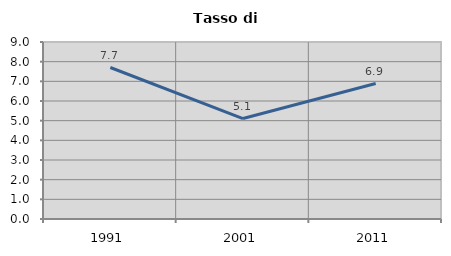
| Category | Tasso di disoccupazione   |
|---|---|
| 1991.0 | 7.703 |
| 2001.0 | 5.109 |
| 2011.0 | 6.889 |